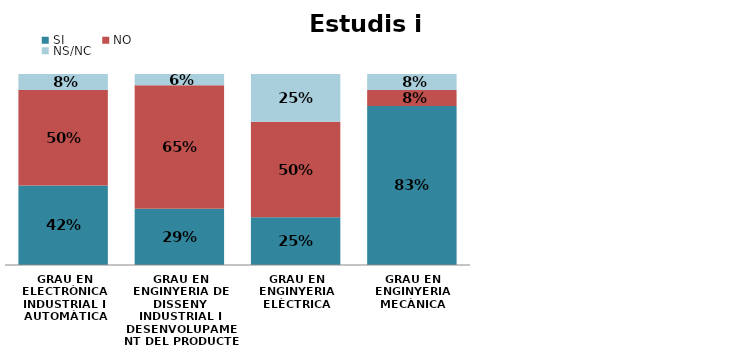
| Category | SÍ | NO | NS/NC |
|---|---|---|---|
| GRAU EN ELECTRÒNICA INDUSTRIAL I AUTOMÀTICA | 0.417 | 0.5 | 0.083 |
| GRAU EN ENGINYERIA DE DISSENY INDUSTRIAL I DESENVOLUPAMENT DEL PRODUCTE | 0.294 | 0.647 | 0.059 |
| GRAU EN ENGINYERIA ELÈCTRICA | 0.25 | 0.5 | 0.25 |
| GRAU EN ENGINYERIA MECÀNICA | 0.833 | 0.083 | 0.083 |